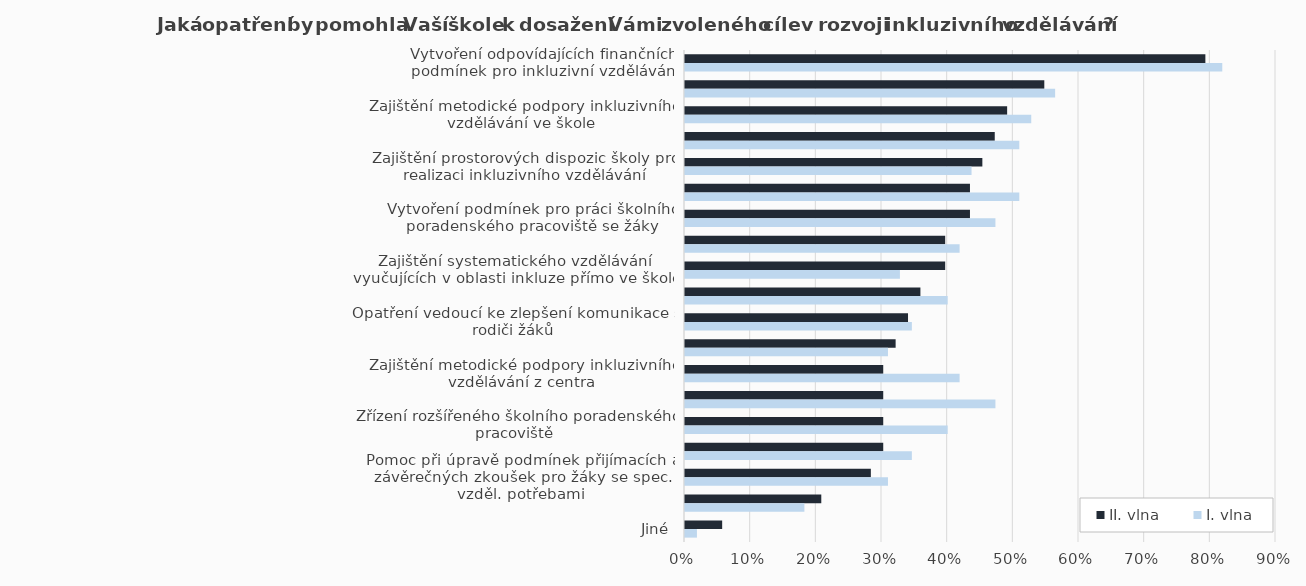
| Category | II. vlna | I. vlna |
|---|---|---|
| Vytvoření odpovídajících finančních podmínek pro inkluzivní vzdělávání | 0.792 | 0.818 |
| Vytvoření odpovídajících personálních podmínek pro inkluzivní vzdělávání | 0.547 | 0.564 |
| Zajištění metodické podpory inkluzivního vzdělávání ve škole | 0.491 | 0.527 |
| Další vzdělávání pedagog. prac. v oblasti metod a forem práce | 0.472 | 0.509 |
| Zajištění prostorových dispozic školy pro realizaci inkluzivního vzdělávání | 0.453 | 0.436 |
| Zajištění dostatečných možností pro vzdělávání pedagogů v oblasti inkluzivního vzdělávání | 0.434 | 0.509 |
| Vytvoření podmínek pro práci školního poradenského pracoviště se žáky | 0.434 | 0.473 |
| Další vzdělávání pedagog. prac. v oblasti hodnocení žáků, využívání formativního hodnocení | 0.396 | 0.418 |
| Zajištění systematického vzdělávání vyučujících v oblasti inkluze přímo ve škole | 0.396 | 0.327 |
| Zajištění asistentů pedagoga pro realizaci inkluzivního vzdělávání | 0.358 | 0.4 |
| Opatření vedoucí ke zlepšení komunikace s rodiči žáků | 0.34 | 0.345 |
| Zajištění metodického vedení školního poradenského pracoviště | 0.321 | 0.309 |
| Zajištění metodické podpory inkluzivního vzdělávání z centra | 0.302 | 0.418 |
| Vytvoření odpovídajících legislativních podmínek pro inkluzivní vzdělávání | 0.302 | 0.473 |
| Zřízení rozšířeného školního poradenského pracoviště | 0.302 | 0.4 |
| Další vzdělávání pedagogických pracovníků pro vyučující školy – oblast úpravy vzdělávacích obsahů | 0.302 | 0.345 |
| Pomoc při úpravě podmínek přijímacích a závěrečných zkoušek pro žáky se spec. vzděl. potřebami | 0.283 | 0.309 |
| Zajištění speciálních pedagogů pro předměty speciálně pedagogické péče | 0.208 | 0.182 |
| Jiné | 0.057 | 0.018 |